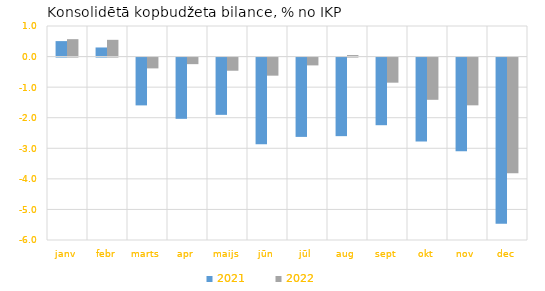
| Category | 2021 | 2022 |
|---|---|---|
| janv | 0.506 | 0.569 |
| febr | 0.298 | 0.548 |
| marts | -1.564 | -0.354 |
| apr | -2.004 | -0.215 |
| maijs | -1.874 | -0.43 |
| jūn | -2.835 | -0.592 |
| jūl | -2.595 | -0.256 |
| aug | -2.57 | 0.05 |
| sept | -2.212 | -0.821 |
| okt | -2.749 | -1.381 |
| nov | -3.067 | -1.562 |
| dec | -5.435 | -3.781 |